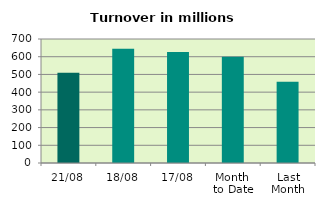
| Category | Series 0 |
|---|---|
| 21/08 | 509.469 |
| 18/08 | 644.33 |
| 17/08 | 626.561 |
| Month 
to Date | 599.142 |
| Last
Month | 458.733 |